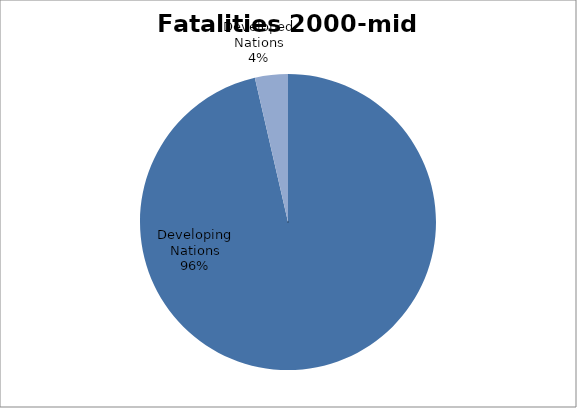
| Category | Series 0 |
|---|---|
| Developing Nations | 20105 |
| Developed Nations | 750 |